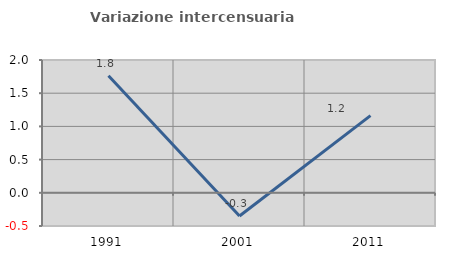
| Category | Variazione intercensuaria annua |
|---|---|
| 1991.0 | 1.763 |
| 2001.0 | -0.349 |
| 2011.0 | 1.163 |